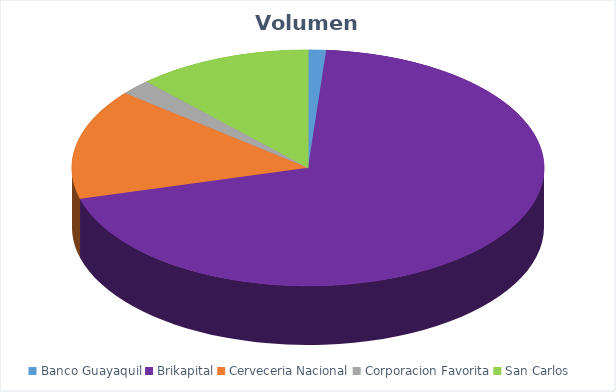
| Category | VOLUMEN ($USD) |
|---|---|
| Banco Guayaquil | 1780 |
| Brikapital | 101000 |
| Cerveceria Nacional | 21960 |
| Corporacion Favorita | 3056.36 |
| San Carlos | 17392.2 |